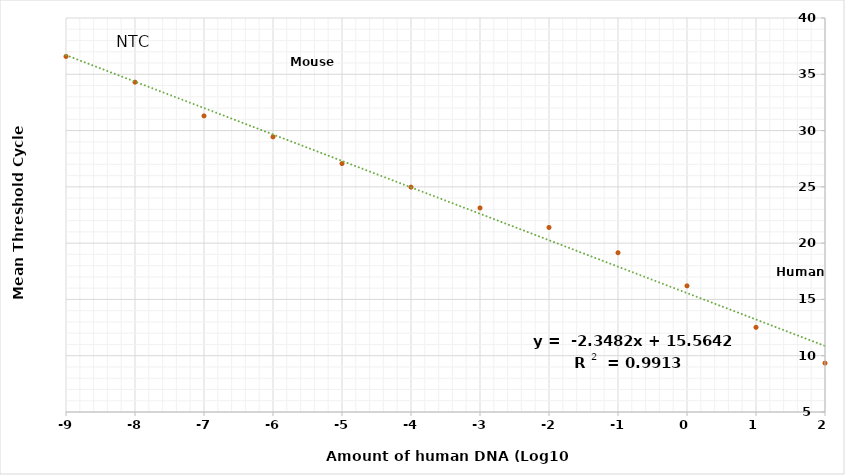
| Category | Series 0 |
|---|---|
| 2.0 | 9.343 |
| 1.0 | 12.523 |
| 0.0 | 16.204 |
| -1.0 | 19.15 |
| -2.0 | 21.393 |
| -3.0 | 23.125 |
| -4.0 | 24.972 |
| -5.0 | 27.067 |
| -6.0 | 29.439 |
| -7.0 | 31.299 |
| -8.0 | 34.3 |
| -9.0 | 36.582 |